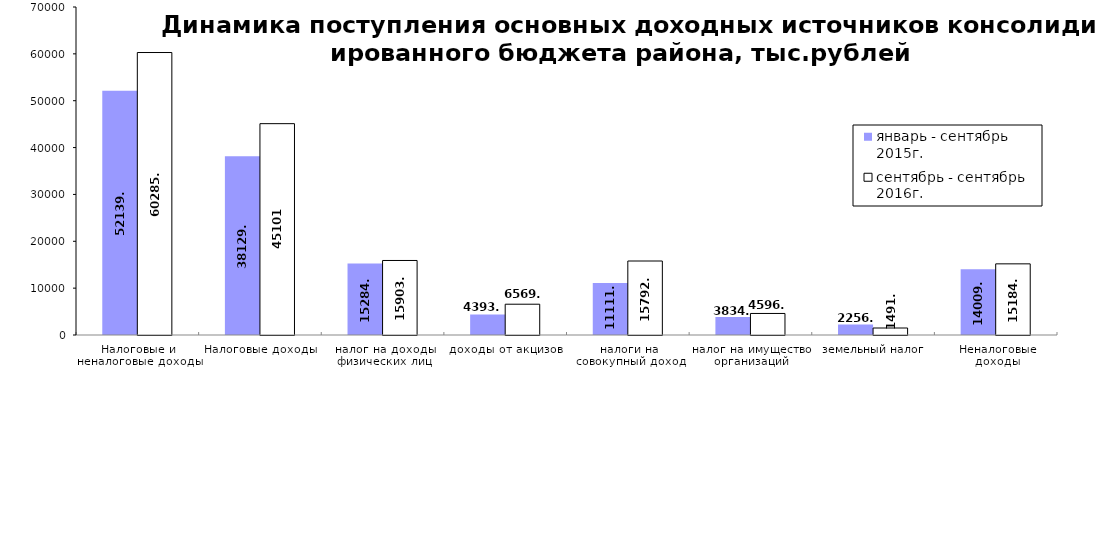
| Category | январь - сентябрь 2015г. | сентябрь - сентябрь 2016г. |
|---|---|---|
| Налоговые и неналоговые доходы | 52139.3 | 60285.7 |
| Налоговые доходы | 38129.5 | 45101 |
| налог на доходы физических лиц | 15284.1 | 15903.2 |
| доходы от акцизов | 4393.7 | 6569.6 |
| налоги на совокупный доход | 11111.3 | 15792.5 |
| налог на имущество организаций | 3834.7 | 4596.4 |
| земельный налог | 2256.9 | 1491.7 |
| Неналоговые доходы | 14009.8 | 15184.7 |